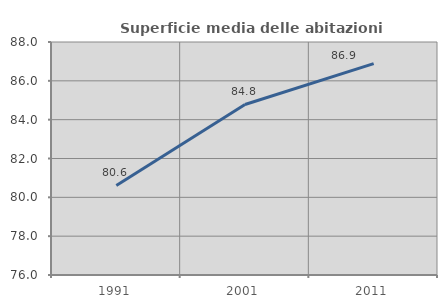
| Category | Superficie media delle abitazioni occupate |
|---|---|
| 1991.0 | 80.615 |
| 2001.0 | 84.783 |
| 2011.0 | 86.89 |